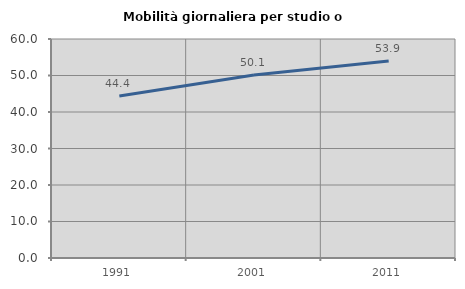
| Category | Mobilità giornaliera per studio o lavoro |
|---|---|
| 1991.0 | 44.361 |
| 2001.0 | 50.138 |
| 2011.0 | 53.946 |